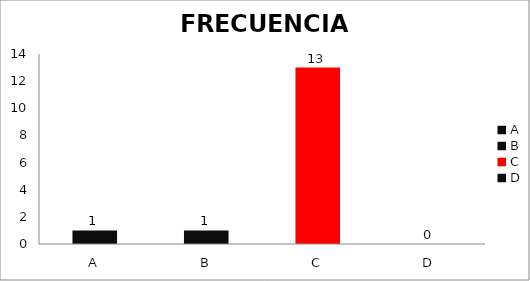
| Category | Series 0 |
|---|---|
| A | 1 |
| B | 1 |
| C | 13 |
| D | 0 |